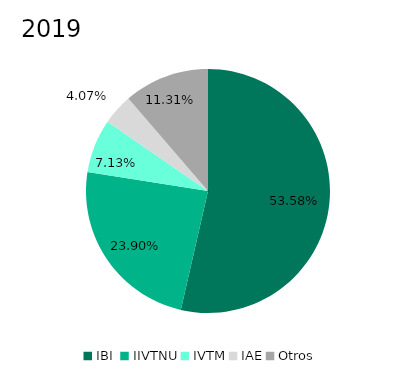
| Category | 2019 |
|---|---|
| IBI  | 0.536 |
| IIVTNU | 0.239 |
| IVTM | 0.071 |
| IAE | 0.041 |
| Otros | 0.113 |